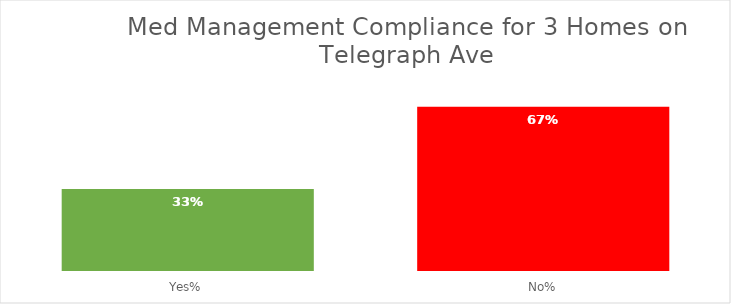
| Category | Series 0 |
|---|---|
| Yes% | 0.333 |
| No% | 0.667 |